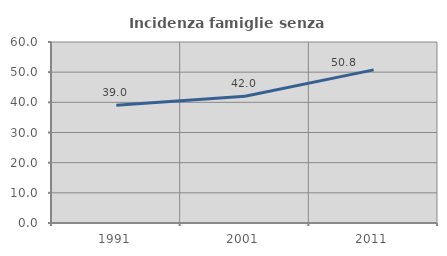
| Category | Incidenza famiglie senza nuclei |
|---|---|
| 1991.0 | 39.013 |
| 2001.0 | 42.029 |
| 2011.0 | 50.761 |